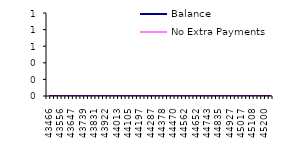
| Category | Balance | No Extra Payments |
|---|---|---|
| 2019-01-01 | 27434.21 | 27434.214 |
| 2019-02-01 | 27025.64 | 27025.649 |
| 2019-03-01 | 26615.29 | 26615.296 |
| 2019-04-01 | 26203.14 | 26203.148 |
| 2019-05-01 | 25789.19 | 25789.197 |
| 2019-06-01 | 25373.43 | 25373.435 |
| 2019-07-01 | 24955.85 | 24955.853 |
| 2019-08-01 | 24536.44 | 24536.445 |
| 2019-09-01 | 24115.2 | 24115.202 |
| 2019-10-01 | 23692.11 | 23692.116 |
| 2019-11-01 | 23267.17 | 23267.179 |
| 2019-12-01 | 22840.37 | 22840.383 |
| 2020-01-01 | 22411.71 | 22411.72 |
| 2020-02-01 | 21981.17 | 21981.181 |
| 2020-03-01 | 21548.75 | 21548.759 |
| 2020-04-01 | 21114.44 | 21114.445 |
| 2020-05-01 | 20678.23 | 20678.23 |
| 2020-06-01 | 20240.11 | 20240.108 |
| 2020-07-01 | 19800.07 | 19800.068 |
| 2020-08-01 | 19358.11 | 19358.103 |
| 2020-09-01 | 18914.21 | 18914.205 |
| 2020-10-01 | 18468.37 | 18468.365 |
| 2020-11-01 | 18020.58 | 18020.574 |
| 2020-12-01 | 17570.83 | 17570.824 |
| 2021-01-01 | 17119.11 | 17119.106 |
| 2021-02-01 | 16665.42 | 16665.412 |
| 2021-03-01 | 16209.74 | 16209.733 |
| 2021-04-01 | 15752.07 | 15752.061 |
| 2021-05-01 | 15292.4 | 15292.386 |
| 2021-06-01 | 14830.71 | 14830.701 |
| 2021-07-01 | 14367 | 14366.995 |
| 2021-08-01 | 13901.27 | 13901.26 |
| 2021-09-01 | 13433.5 | 13433.488 |
| 2021-10-01 | 12963.68 | 12963.67 |
| 2021-11-01 | 12491.81 | 12491.796 |
| 2021-12-01 | 12017.87 | 12017.858 |
| 2022-01-01 | 11541.86 | 11541.846 |
| 2022-02-01 | 11063.77 | 11063.751 |
| 2022-03-01 | 10583.58 | 10583.565 |
| 2022-04-01 | 10101.29 | 10101.278 |
| 2022-05-01 | 9616.89 | 9616.881 |
| 2022-06-01 | 9130.37 | 9130.365 |
| 2022-07-01 | 8641.73 | 8641.721 |
| 2022-08-01 | 8150.95 | 8150.938 |
| 2022-09-01 | 7658.02 | 7658.008 |
| 2022-10-01 | 7162.93 | 7162.922 |
| 2022-11-01 | 6665.68 | 6665.67 |
| 2022-12-01 | 6166.25 | 6166.242 |
| 2023-01-01 | 5664.64 | 5664.63 |
| 2023-02-01 | 5160.83 | 5160.822 |
| 2023-03-01 | 4654.82 | 4654.811 |
| 2023-04-01 | 4146.59 | 4146.586 |
| 2023-05-01 | 3636.14 | 3636.137 |
| 2023-06-01 | 3123.46 | 3123.455 |
| 2023-07-01 | 2608.54 | 2608.53 |
| 2023-08-01 | 2091.36 | 2091.353 |
| 2023-09-01 | 1571.92 | 1571.912 |
| 2023-10-01 | 1050.21 | 1050.199 |
| 2023-11-01 | 526.21 | 526.204 |
| 2023-12-01 | 0 | -0.084 |